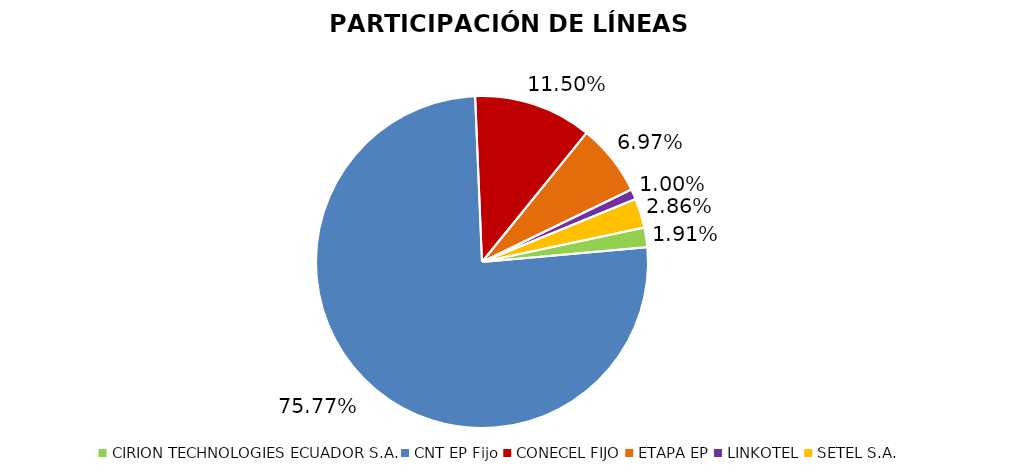
| Category | Participación en el Mercado |
|---|---|
| CIRION TECHNOLOGIES ECUADOR S.A. | 0.019 |
| CNT EP Fijo | 0.758 |
| CONECEL FIJO | 0.115 |
| ETAPA EP | 0.07 |
| LINKOTEL | 0.01 |
| SETEL S.A. | 0.029 |